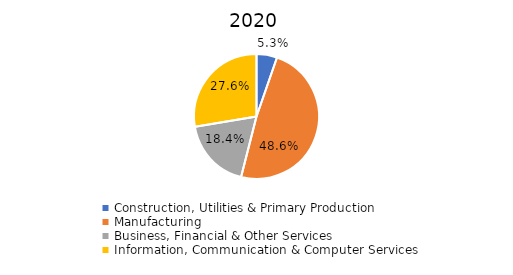
| Category | 2020 |
|---|---|
| Construction, Utilities & Primary Production  | 0.053 |
| Manufacturing  | 0.486 |
| Business, Financial & Other Services | 0.184 |
| Information, Communication & Computer Services | 0.276 |